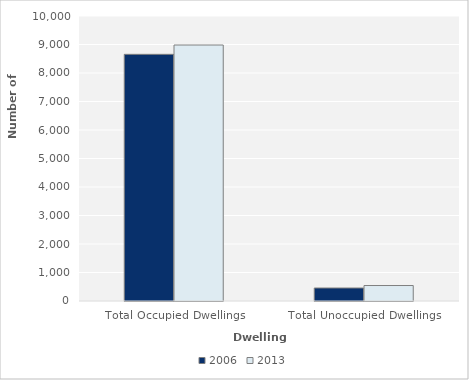
| Category | 2006 | 2013 |
|---|---|---|
| Total Occupied Dwellings | 8655 | 8982 |
| Total Unoccupied Dwellings | 456 | 543 |